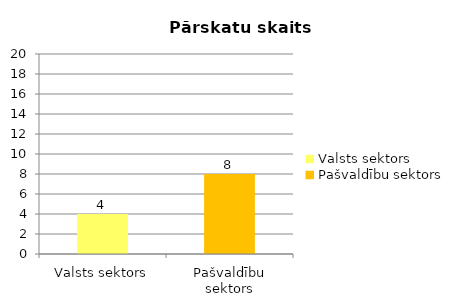
| Category |  Pārskatu skaits |
|---|---|
| Valsts sektors | 4 |
| Pašvaldību sektors | 8 |